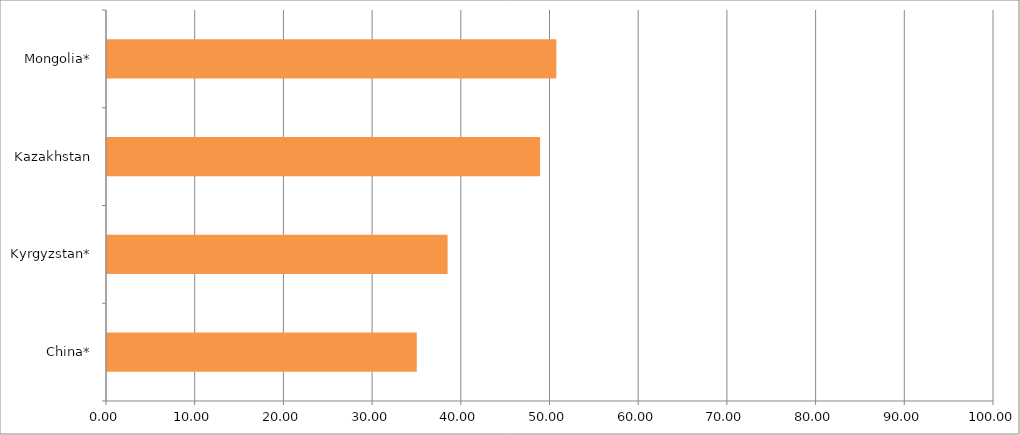
| Category | Series 0 |
|---|---|
| China* | 34.922 |
| Kyrgyzstan* | 38.4 |
| Kazakhstan | 48.83 |
| Mongolia* | 50.659 |